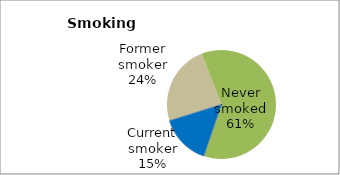
| Category | Series 0 |
|---|---|
| Current smoker | 14.892 |
| Former smoker | 23.892 |
| Never smoked | 61.217 |